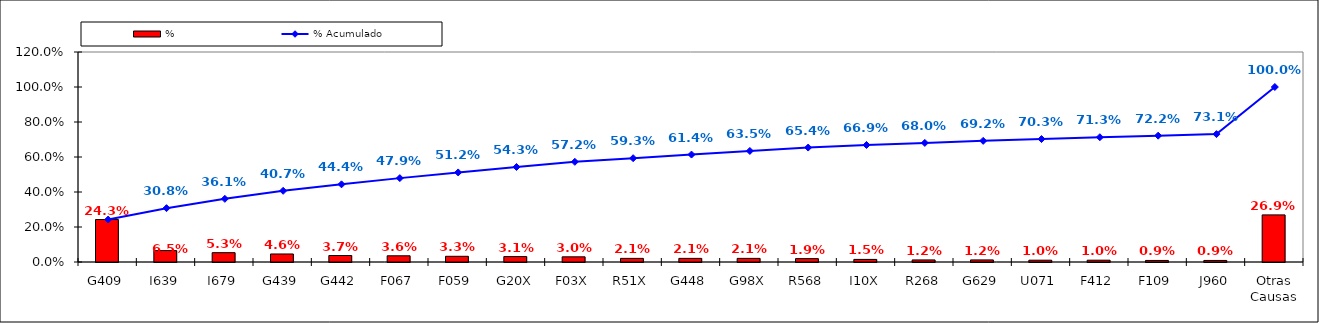
| Category | % |
|---|---|
| G409 | 0.243 |
| I639 | 0.065 |
| I679 | 0.053 |
| G439 | 0.046 |
| G442 | 0.037 |
| F067 | 0.036 |
| F059 | 0.033 |
| G20X | 0.031 |
| F03X | 0.03 |
| R51X | 0.021 |
| G448 | 0.021 |
| G98X | 0.021 |
| R568 | 0.019 |
| I10X | 0.015 |
| R268 | 0.012 |
| G629 | 0.012 |
| U071 | 0.01 |
| F412 | 0.01 |
| F109 | 0.009 |
| J960 | 0.009 |
| Otras Causas | 0.269 |